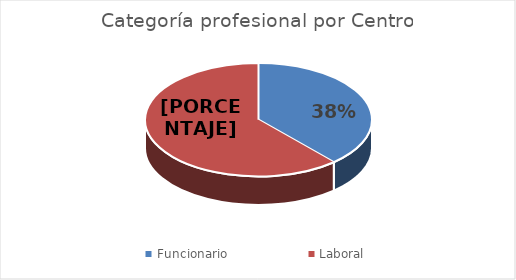
| Category | Series 0 |
|---|---|
| Funcionario | 15 |
| Laboral | 24 |